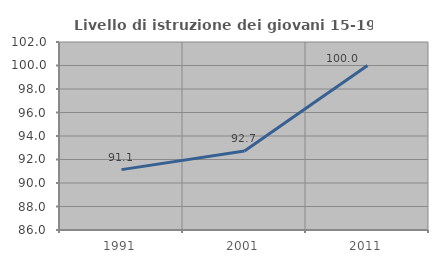
| Category | Livello di istruzione dei giovani 15-19 anni |
|---|---|
| 1991.0 | 91.139 |
| 2001.0 | 92.727 |
| 2011.0 | 100 |